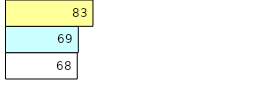
| Category | Total Standouts | Total Recd | Total Tipsters |
|---|---|---|---|
| 0 | 68 | 69 | 83 |